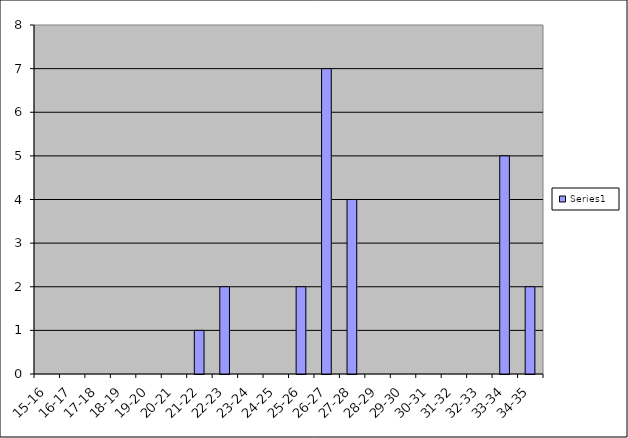
| Category | Series 0 |
|---|---|
| 15-16 | 0 |
| 16-17 | 0 |
| 17-18 | 0 |
| 18-19 | 0 |
| 19-20 | 0 |
| 20-21 | 0 |
| 21-22 | 1 |
| 22-23 | 2 |
| 23-24 | 0 |
| 24-25 | 0 |
| 25-26 | 2 |
| 26-27 | 7 |
| 27-28 | 4 |
| 28-29 | 0 |
| 29-30 | 0 |
| 30-31 | 0 |
| 31-32 | 0 |
| 32-33 | 0 |
| 33-34 | 5 |
| 34-35 | 2 |